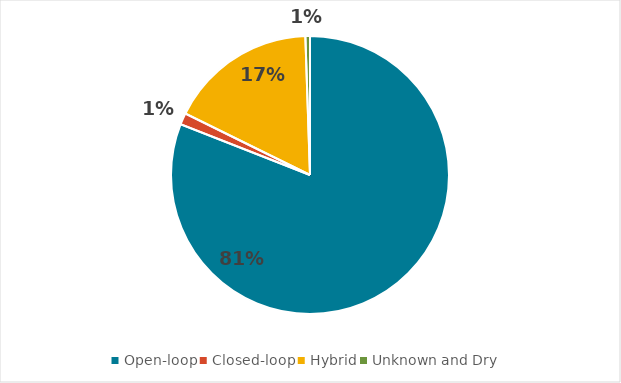
| Category | Series 0 |
|---|---|
| Open-loop | 0.81 |
| Closed-loop | 0.013 |
| Hybrid | 0.172 |
| Unknown and Dry | 0.005 |